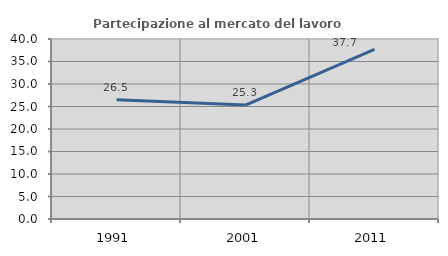
| Category | Partecipazione al mercato del lavoro  femminile |
|---|---|
| 1991.0 | 26.524 |
| 2001.0 | 25.329 |
| 2011.0 | 37.698 |